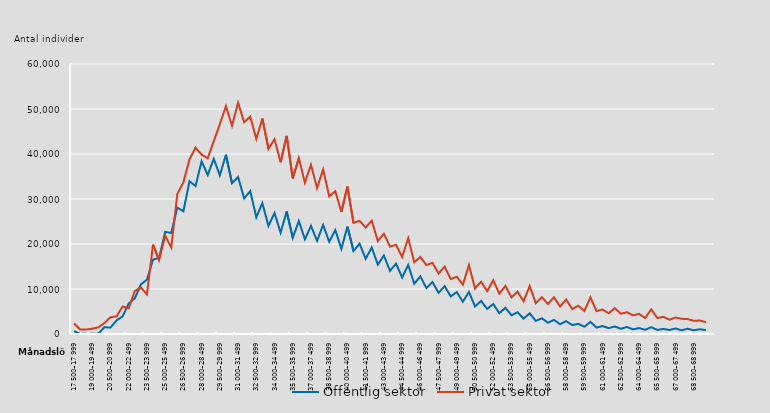
| Category | Offentlig sektor | Privat sektor |
|---|---|---|
| 17 500–17 999 | 637 | 2358 |
| 18 000–18 499 | 23 | 998 |
| 18 500–18 999 | 37 | 994 |
| 19 000–19 499 | 54 | 1173 |
| 19 500–19 999 | 71 | 1469 |
| 20 000–20 499 | 1524 | 2442 |
| 20 500–20 999 | 1425 | 3734 |
| 21 000–21 499 | 3012 | 3916 |
| 21 500–21 999 | 3914 | 6124 |
| 22 000–22 499 | 6775 | 5708 |
| 22 500–22 999 | 7921 | 9549 |
| 23 000–23 499 | 11020 | 10333 |
| 23 500–23 999 | 12077 | 8814 |
| 24 000–24 499 | 16538 | 19863 |
| 24 500–24 999 | 16903 | 16407 |
| 25 000–25 499 | 22697 | 21853 |
| 25 500–25 999 | 22465 | 19199 |
| 26 000–26 499 | 28096 | 31124 |
| 26 500–26 999 | 27279 | 33699 |
| 27 000–27 499 | 33941 | 38795 |
| 27 500–27 999 | 32894 | 41416 |
| 28 000–28 499 | 38383 | 39842 |
| 28 500–28 999 | 35344 | 39064 |
| 29 000–29 499 | 38921 | 42842 |
| 29 500–29 999 | 35258 | 46641 |
| 30 000–30 499 | 39838 | 50626 |
| 30 500–30 999 | 33505 | 46290 |
| 31 000–31 499 | 34893 | 51410 |
| 31 500–31 999 | 30138 | 47072 |
| 32 000–32 499 | 31753 | 48296 |
| 32 500–32 999 | 25944 | 43386 |
| 33 000–33 499 | 29082 | 47878 |
| 33 500–33 999 | 24022 | 41157 |
| 34 000–34 499 | 26885 | 43297 |
| 34 500–34 999 | 22529 | 38169 |
| 35 000–35 499 | 27220 | 44029 |
| 35 500–35 999 | 21382 | 34602 |
| 36 000–36 499 | 25107 | 39103 |
| 36 500–36 999 | 21053 | 33622 |
| 37 000–37 499 | 24030 | 37604 |
| 37 500–37 999 | 20700 | 32422 |
| 38 000–38 499 | 24239 | 36582 |
| 38 500–38 999 | 20495 | 30587 |
| 39 000–39 499 | 23081 | 31725 |
| 39 500–39 999 | 18925 | 27115 |
| 40 000–40 499 | 23860 | 32738 |
| 40 500–40 999 | 18442 | 24708 |
| 41 000–41 499 | 20074 | 25140 |
| 41 500–41 999 | 16721 | 23661 |
| 42 000–42 499 | 19223 | 25203 |
| 42 500–42 999 | 15420 | 20667 |
| 43 000–43 499 | 17442 | 22267 |
| 43 500–43 999 | 14026 | 19433 |
| 44 000–44 499 | 15642 | 19815 |
| 44 500–44 999 | 12559 | 17097 |
| 45 000–45 499 | 15337 | 21283 |
| 45 500–45 999 | 11175 | 15940 |
| 46 000–46 499 | 12814 | 17117 |
| 46 500–46 999 | 10194 | 15321 |
| 47 000–47 499 | 11536 | 15803 |
| 47 500–47 999 | 9159 | 13448 |
| 48 000–48 499 | 10637 | 14973 |
| 48 500–48 999 | 8356 | 12212 |
| 49 000–49 499 | 9300 | 12720 |
| 49 500–49 999 | 7187 | 10941 |
| 50 000–50 499 | 9359 | 15340 |
| 50 500–50 999 | 6120 | 10110 |
| 51 000–51 499 | 7350 | 11615 |
| 51 500–51 999 | 5578 | 9523 |
| 52 000–52 499 | 6658 | 11932 |
| 52 500–52 999 | 4624 | 8969 |
| 53 000–53 499 | 5831 | 10696 |
| 53 500–53 999 | 4173 | 8135 |
| 54 000–54 499 | 4846 | 9412 |
| 54 500–54 999 | 3416 | 7255 |
| 55 000–55 499 | 4599 | 10681 |
| 55 500–55 999 | 2902 | 6861 |
| 56 000–56 499 | 3496 | 8190 |
| 56 500–56 999 | 2513 | 6676 |
| 57 000–57 499 | 3121 | 8161 |
| 57 500–57 999 | 2174 | 6100 |
| 58 000–58 499 | 2847 | 7659 |
| 58 500–58 999 | 1978 | 5538 |
| 59 000–59 499 | 2260 | 6291 |
| 59 500–59 999 | 1620 | 5116 |
| 60 000–60 499 | 2690 | 8138 |
| 60 500–60 999 | 1430 | 5087 |
| 61 000–61 499 | 1761 | 5425 |
| 61 500–61 999 | 1308 | 4618 |
| 62 000–62 499 | 1662 | 5761 |
| 62 500–62 999 | 1170 | 4497 |
| 63 000–63 499 | 1561 | 4843 |
| 63 500–63 999 | 1025 | 4141 |
| 64 000–64 499 | 1315 | 4477 |
| 64 500–64 999 | 939 | 3558 |
| 65 000–65 499 | 1503 | 5489 |
| 65 500–65 999 | 915 | 3552 |
| 66 000–66 499 | 1118 | 3808 |
| 66 500–66 999 | 892 | 3172 |
| 67 000–67 499 | 1229 | 3656 |
| 67 500–67 999 | 831 | 3380 |
| 68 000–68 499 | 1164 | 3308 |
| 68 500–68 999 | 826 | 2942 |
| 69 000–69 499 | 1054 | 2991 |
| 69 500–69 999 | 858 | 2629 |